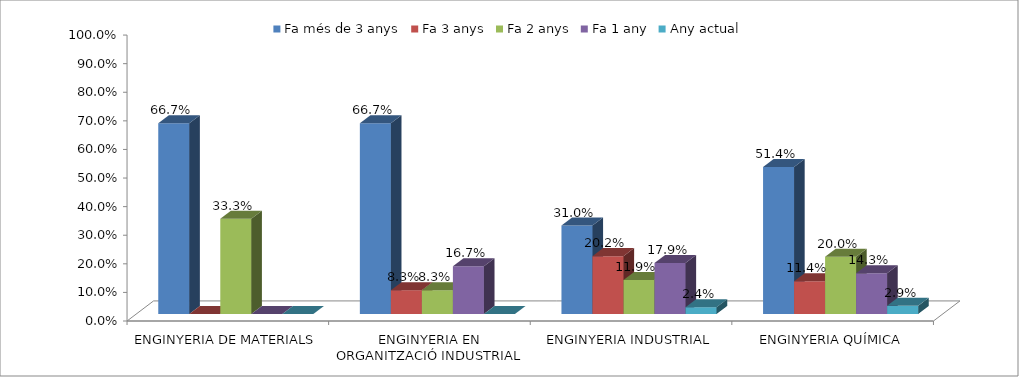
| Category | Fa més de 3 anys | Fa 3 anys | Fa 2 anys | Fa 1 any | Any actual |
|---|---|---|---|---|---|
| ENGINYERIA DE MATERIALS | 0.667 | 0 | 0.333 | 0 | 0 |
| ENGINYERIA EN ORGANITZACIÓ INDUSTRIAL | 0.667 | 0.083 | 0.083 | 0.167 | 0 |
| ENGINYERIA INDUSTRIAL | 0.31 | 0.202 | 0.119 | 0.179 | 0.024 |
| ENGINYERIA QUÍMICA | 0.514 | 0.114 | 0.2 | 0.143 | 0.029 |